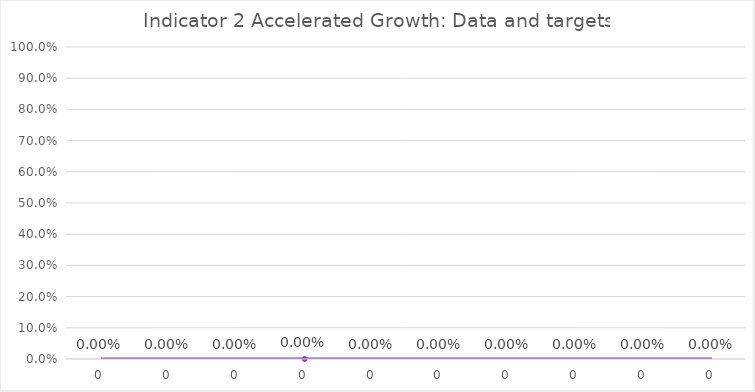
| Category | Series 0 |
|---|---|
| 0.0 | 0 |
| 0.0 | 0 |
| 0.0 | 0 |
| 0.0 | 0 |
| 0.0 | 0 |
| 0.0 | 0 |
| 0.0 | 0 |
| 0.0 | 0 |
| 0.0 | 0 |
| 0.0 | 0 |